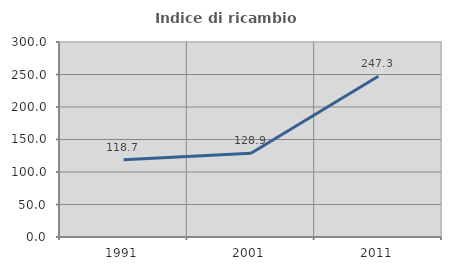
| Category | Indice di ricambio occupazionale  |
|---|---|
| 1991.0 | 118.71 |
| 2001.0 | 128.931 |
| 2011.0 | 247.328 |